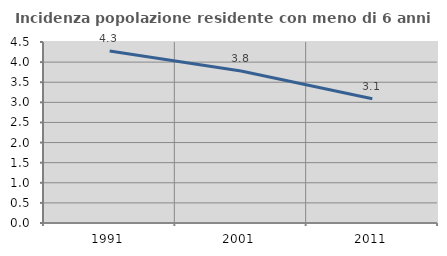
| Category | Incidenza popolazione residente con meno di 6 anni |
|---|---|
| 1991.0 | 4.276 |
| 2001.0 | 3.781 |
| 2011.0 | 3.091 |